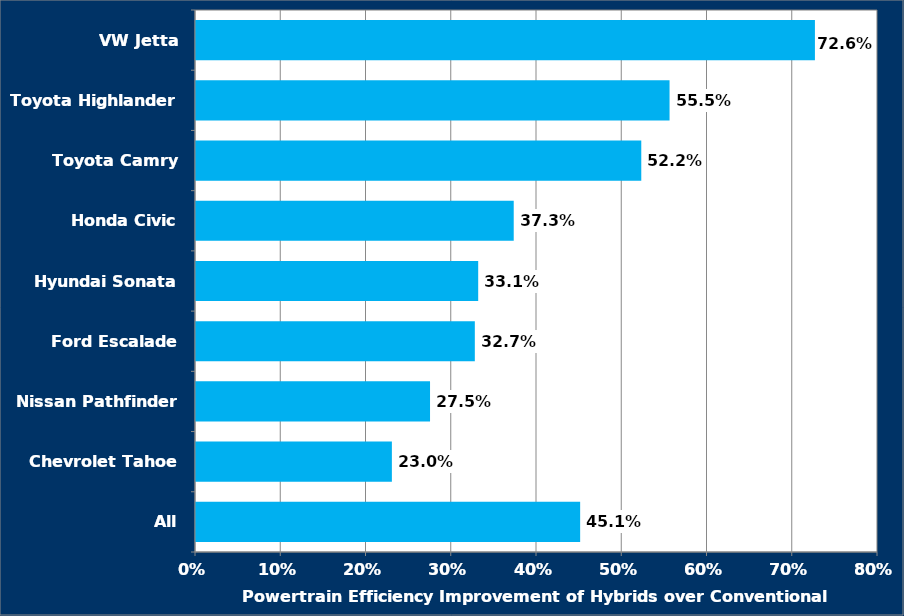
| Category | Series 0 |
|---|---|
| All | 0.451 |
| Chevrolet Tahoe | 0.23 |
| Nissan Pathfinder | 0.275 |
| Ford Escalade | 0.327 |
| Hyundai Sonata | 0.331 |
| Honda Civic | 0.373 |
| Toyota Camry | 0.522 |
| Toyota Highlander | 0.555 |
| VW Jetta | 0.726 |